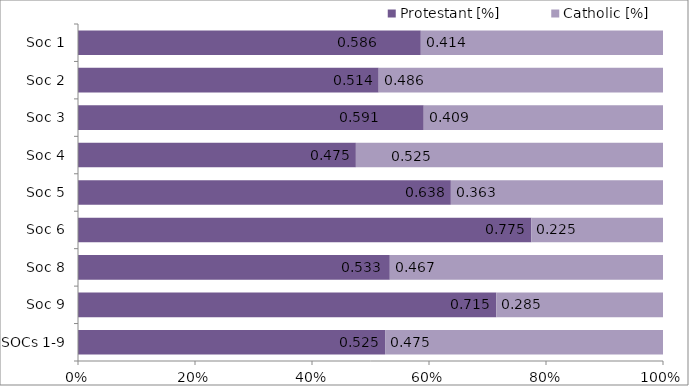
| Category | Protestant | Catholic |
|---|---|---|
| SOCs 1-9 | 0.525 | 0.475 |
| Soc 9 | 0.715 | 0.285 |
| Soc 8 | 0.533 | 0.467 |
| Soc 6 | 0.775 | 0.225 |
| Soc 5 | 0.638 | 0.363 |
| Soc 4 | 0.475 | 0.525 |
| Soc 3 | 0.591 | 0.409 |
| Soc 2 | 0.514 | 0.486 |
| Soc 1 | 0.586 | 0.414 |